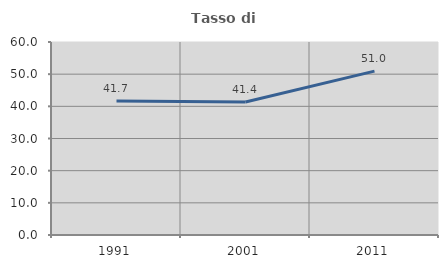
| Category | Tasso di occupazione   |
|---|---|
| 1991.0 | 41.667 |
| 2001.0 | 41.367 |
| 2011.0 | 50.955 |